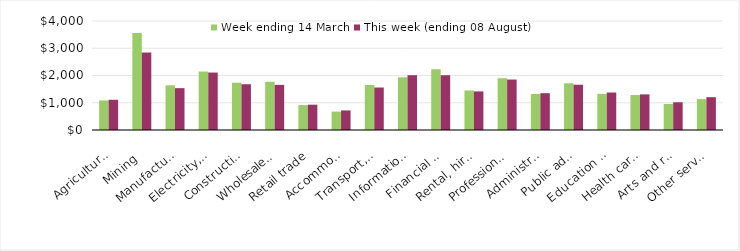
| Category | Week ending 14 March | This week (ending 08 August) |
|---|---|---|
| Agriculture, forestry and fishing | 1085.06 | 1109.14 |
| Mining | 3560.54 | 2843.1 |
| Manufacturing | 1639.7 | 1535.82 |
| Electricity, gas, water and waste services | 2144.93 | 2108.25 |
| Construction | 1735.53 | 1679.84 |
| Wholesale trade | 1770.19 | 1656.28 |
| Retail trade | 914.23 | 928.41 |
| Accommodation and food services | 674.22 | 718.02 |
| Transport, postal and warehousing | 1653.76 | 1559.25 |
| Information media and telecommunications | 1934.83 | 2011.59 |
| Financial and insurance services | 2227.92 | 2010.12 |
| Rental, hiring and real estate services | 1450.17 | 1416.21 |
| Professional, scientific and technical services | 1900.76 | 1852.11 |
| Administrative and support services | 1320.49 | 1350.57 |
| Public administration and safety | 1714.29 | 1661.11 |
| Education and training | 1328.19 | 1375.03 |
| Health care and social assistance | 1283.38 | 1307.41 |
| Arts and recreation services | 955.46 | 1018.13 |
| Other services | 1133.91 | 1204.15 |